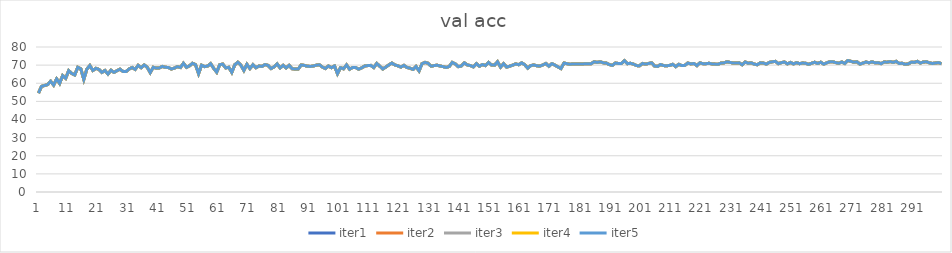
| Category | iter1 | iter2 | iter3 | iter4 | iter5 |
|---|---|---|---|---|---|
| 0 | 54.556 | 54.556 | 54.556 | 54.556 | 54.556 |
| 1 | 58.294 | 58.294 | 58.294 | 58.294 | 58.294 |
| 2 | 58.762 | 58.762 | 58.762 | 58.762 | 58.762 |
| 3 | 59.229 | 59.229 | 59.229 | 59.229 | 59.229 |
| 4 | 61.098 | 61.098 | 61.098 | 61.098 | 61.098 |
| 5 | 58.995 | 58.995 | 58.995 | 58.995 | 58.995 |
| 6 | 62.383 | 62.383 | 62.383 | 62.383 | 62.383 |
| 7 | 59.93 | 59.93 | 59.93 | 59.93 | 59.93 |
| 8 | 64.252 | 64.252 | 64.252 | 64.252 | 64.252 |
| 9 | 62.734 | 62.734 | 62.734 | 62.734 | 62.734 |
| 10 | 66.939 | 66.939 | 66.939 | 66.939 | 66.939 |
| 11 | 65.421 | 65.421 | 65.421 | 65.421 | 65.421 |
| 12 | 64.603 | 64.603 | 64.603 | 64.603 | 64.603 |
| 13 | 68.808 | 68.808 | 68.808 | 68.808 | 68.808 |
| 14 | 67.991 | 67.991 | 67.991 | 67.991 | 67.991 |
| 15 | 62.15 | 62.15 | 62.15 | 62.15 | 62.15 |
| 16 | 67.757 | 67.757 | 67.757 | 67.757 | 67.757 |
| 17 | 69.743 | 69.743 | 69.743 | 69.743 | 69.743 |
| 18 | 67.056 | 67.056 | 67.056 | 67.056 | 67.056 |
| 19 | 68.224 | 68.224 | 68.224 | 68.224 | 68.224 |
| 20 | 67.64 | 67.64 | 67.64 | 67.64 | 67.64 |
| 21 | 66.005 | 66.005 | 66.005 | 66.005 | 66.005 |
| 22 | 67.056 | 67.056 | 67.056 | 67.056 | 67.056 |
| 23 | 65.07 | 65.07 | 65.07 | 65.07 | 65.07 |
| 24 | 67.173 | 67.173 | 67.173 | 67.173 | 67.173 |
| 25 | 66.005 | 66.005 | 66.005 | 66.005 | 66.005 |
| 26 | 66.939 | 66.939 | 66.939 | 66.939 | 66.939 |
| 27 | 67.757 | 67.757 | 67.757 | 67.757 | 67.757 |
| 28 | 66.472 | 66.472 | 66.472 | 66.472 | 66.472 |
| 29 | 66.472 | 66.472 | 66.472 | 66.472 | 66.472 |
| 30 | 67.874 | 67.874 | 67.874 | 67.874 | 67.874 |
| 31 | 68.692 | 68.692 | 68.692 | 68.692 | 68.692 |
| 32 | 67.64 | 67.64 | 67.64 | 67.64 | 67.64 |
| 33 | 69.86 | 69.86 | 69.86 | 69.86 | 69.86 |
| 34 | 68.575 | 68.575 | 68.575 | 68.575 | 68.575 |
| 35 | 70.094 | 70.094 | 70.094 | 70.094 | 70.094 |
| 36 | 68.808 | 68.808 | 68.808 | 68.808 | 68.808 |
| 37 | 65.888 | 65.888 | 65.888 | 65.888 | 65.888 |
| 38 | 68.808 | 68.808 | 68.808 | 68.808 | 68.808 |
| 39 | 68.341 | 68.341 | 68.341 | 68.341 | 68.341 |
| 40 | 68.458 | 68.458 | 68.458 | 68.458 | 68.458 |
| 41 | 69.276 | 69.276 | 69.276 | 69.276 | 69.276 |
| 42 | 68.808 | 68.808 | 68.808 | 68.808 | 68.808 |
| 43 | 68.692 | 68.692 | 68.692 | 68.692 | 68.692 |
| 44 | 67.874 | 67.874 | 67.874 | 67.874 | 67.874 |
| 45 | 68.341 | 68.341 | 68.341 | 68.341 | 68.341 |
| 46 | 69.159 | 69.159 | 69.159 | 69.159 | 69.159 |
| 47 | 68.692 | 68.692 | 68.692 | 68.692 | 68.692 |
| 48 | 71.028 | 71.028 | 71.028 | 71.028 | 71.028 |
| 49 | 68.808 | 68.808 | 68.808 | 68.808 | 68.808 |
| 50 | 69.626 | 69.626 | 69.626 | 69.626 | 69.626 |
| 51 | 71.028 | 71.028 | 71.028 | 71.028 | 71.028 |
| 52 | 70.21 | 70.21 | 70.21 | 70.21 | 70.21 |
| 53 | 65.304 | 65.304 | 65.304 | 65.304 | 65.304 |
| 54 | 69.977 | 69.977 | 69.977 | 69.977 | 69.977 |
| 55 | 69.159 | 69.159 | 69.159 | 69.159 | 69.159 |
| 56 | 69.509 | 69.509 | 69.509 | 69.509 | 69.509 |
| 57 | 70.794 | 70.794 | 70.794 | 70.794 | 70.794 |
| 58 | 68.224 | 68.224 | 68.224 | 68.224 | 68.224 |
| 59 | 66.122 | 66.122 | 66.122 | 66.122 | 66.122 |
| 60 | 70.21 | 70.21 | 70.21 | 70.21 | 70.21 |
| 61 | 70.561 | 70.561 | 70.561 | 70.561 | 70.561 |
| 62 | 68.458 | 68.458 | 68.458 | 68.458 | 68.458 |
| 63 | 68.808 | 68.808 | 68.808 | 68.808 | 68.808 |
| 64 | 66.005 | 66.005 | 66.005 | 66.005 | 66.005 |
| 65 | 70.21 | 70.21 | 70.21 | 70.21 | 70.21 |
| 66 | 71.612 | 71.612 | 71.612 | 71.612 | 71.612 |
| 67 | 69.977 | 69.977 | 69.977 | 69.977 | 69.977 |
| 68 | 67.056 | 67.056 | 67.056 | 67.056 | 67.056 |
| 69 | 70.444 | 70.444 | 70.444 | 70.444 | 70.444 |
| 70 | 68.108 | 68.108 | 68.108 | 68.108 | 68.108 |
| 71 | 70.21 | 70.21 | 70.21 | 70.21 | 70.21 |
| 72 | 68.575 | 68.575 | 68.575 | 68.575 | 68.575 |
| 73 | 69.509 | 69.509 | 69.509 | 69.509 | 69.509 |
| 74 | 69.276 | 69.276 | 69.276 | 69.276 | 69.276 |
| 75 | 70.327 | 70.327 | 70.327 | 70.327 | 70.327 |
| 76 | 69.86 | 69.86 | 69.86 | 69.86 | 69.86 |
| 77 | 68.108 | 68.108 | 68.108 | 68.108 | 68.108 |
| 78 | 69.042 | 69.042 | 69.042 | 69.042 | 69.042 |
| 79 | 70.678 | 70.678 | 70.678 | 70.678 | 70.678 |
| 80 | 68.458 | 68.458 | 68.458 | 68.458 | 68.458 |
| 81 | 69.86 | 69.86 | 69.86 | 69.86 | 69.86 |
| 82 | 68.458 | 68.458 | 68.458 | 68.458 | 68.458 |
| 83 | 69.86 | 69.86 | 69.86 | 69.86 | 69.86 |
| 84 | 67.991 | 67.991 | 67.991 | 67.991 | 67.991 |
| 85 | 67.874 | 67.874 | 67.874 | 67.874 | 67.874 |
| 86 | 67.874 | 67.874 | 67.874 | 67.874 | 67.874 |
| 87 | 70.094 | 70.094 | 70.094 | 70.094 | 70.094 |
| 88 | 69.86 | 69.86 | 69.86 | 69.86 | 69.86 |
| 89 | 69.392 | 69.392 | 69.392 | 69.392 | 69.392 |
| 90 | 69.276 | 69.276 | 69.276 | 69.276 | 69.276 |
| 91 | 69.509 | 69.509 | 69.509 | 69.509 | 69.509 |
| 92 | 69.977 | 69.977 | 69.977 | 69.977 | 69.977 |
| 93 | 70.21 | 70.21 | 70.21 | 70.21 | 70.21 |
| 94 | 68.925 | 68.925 | 68.925 | 68.925 | 68.925 |
| 95 | 68.108 | 68.108 | 68.108 | 68.108 | 68.108 |
| 96 | 69.509 | 69.509 | 69.509 | 69.509 | 69.509 |
| 97 | 68.575 | 68.575 | 68.575 | 68.575 | 68.575 |
| 98 | 69.509 | 69.509 | 69.509 | 69.509 | 69.509 |
| 99 | 65.304 | 65.304 | 65.304 | 65.304 | 65.304 |
| 100 | 68.575 | 68.575 | 68.575 | 68.575 | 68.575 |
| 101 | 67.991 | 67.991 | 67.991 | 67.991 | 67.991 |
| 102 | 70.094 | 70.094 | 70.094 | 70.094 | 70.094 |
| 103 | 67.757 | 67.757 | 67.757 | 67.757 | 67.757 |
| 104 | 68.692 | 68.692 | 68.692 | 68.692 | 68.692 |
| 105 | 68.692 | 68.692 | 68.692 | 68.692 | 68.692 |
| 106 | 67.757 | 67.757 | 67.757 | 67.757 | 67.757 |
| 107 | 68.458 | 68.458 | 68.458 | 68.458 | 68.458 |
| 108 | 69.509 | 69.509 | 69.509 | 69.509 | 69.509 |
| 109 | 69.743 | 69.743 | 69.743 | 69.743 | 69.743 |
| 110 | 69.86 | 69.86 | 69.86 | 69.86 | 69.86 |
| 111 | 68.692 | 68.692 | 68.692 | 68.692 | 68.692 |
| 112 | 70.911 | 70.911 | 70.911 | 70.911 | 70.911 |
| 113 | 69.392 | 69.392 | 69.392 | 69.392 | 69.392 |
| 114 | 67.874 | 67.874 | 67.874 | 67.874 | 67.874 |
| 115 | 68.925 | 68.925 | 68.925 | 68.925 | 68.925 |
| 116 | 70.094 | 70.094 | 70.094 | 70.094 | 70.094 |
| 117 | 71.145 | 71.145 | 71.145 | 71.145 | 71.145 |
| 118 | 70.094 | 70.094 | 70.094 | 70.094 | 70.094 |
| 119 | 69.626 | 69.626 | 69.626 | 69.626 | 69.626 |
| 120 | 68.925 | 68.925 | 68.925 | 68.925 | 68.925 |
| 121 | 69.86 | 69.86 | 69.86 | 69.86 | 69.86 |
| 122 | 68.692 | 68.692 | 68.692 | 68.692 | 68.692 |
| 123 | 68.341 | 68.341 | 68.341 | 68.341 | 68.341 |
| 124 | 67.64 | 67.64 | 67.64 | 67.64 | 67.64 |
| 125 | 69.276 | 69.276 | 69.276 | 69.276 | 69.276 |
| 126 | 66.822 | 66.822 | 66.822 | 66.822 | 66.822 |
| 127 | 70.794 | 70.794 | 70.794 | 70.794 | 70.794 |
| 128 | 71.495 | 71.495 | 71.495 | 71.495 | 71.495 |
| 129 | 71.028 | 71.028 | 71.028 | 71.028 | 71.028 |
| 130 | 69.392 | 69.392 | 69.392 | 69.392 | 69.392 |
| 131 | 69.743 | 69.743 | 69.743 | 69.743 | 69.743 |
| 132 | 69.977 | 69.977 | 69.977 | 69.977 | 69.977 |
| 133 | 69.509 | 69.509 | 69.509 | 69.509 | 69.509 |
| 134 | 69.159 | 69.159 | 69.159 | 69.159 | 69.159 |
| 135 | 68.692 | 68.692 | 68.692 | 68.692 | 68.692 |
| 136 | 69.276 | 69.276 | 69.276 | 69.276 | 69.276 |
| 137 | 71.495 | 71.495 | 71.495 | 71.495 | 71.495 |
| 138 | 70.678 | 70.678 | 70.678 | 70.678 | 70.678 |
| 139 | 69.159 | 69.159 | 69.159 | 69.159 | 69.159 |
| 140 | 69.509 | 69.509 | 69.509 | 69.509 | 69.509 |
| 141 | 71.262 | 71.262 | 71.262 | 71.262 | 71.262 |
| 142 | 70.094 | 70.094 | 70.094 | 70.094 | 70.094 |
| 143 | 69.743 | 69.743 | 69.743 | 69.743 | 69.743 |
| 144 | 69.042 | 69.042 | 69.042 | 69.042 | 69.042 |
| 145 | 70.794 | 70.794 | 70.794 | 70.794 | 70.794 |
| 146 | 69.392 | 69.392 | 69.392 | 69.392 | 69.392 |
| 147 | 70.327 | 70.327 | 70.327 | 70.327 | 70.327 |
| 148 | 69.743 | 69.743 | 69.743 | 69.743 | 69.743 |
| 149 | 71.495 | 71.495 | 71.495 | 71.495 | 71.495 |
| 150 | 70.094 | 70.094 | 70.094 | 70.094 | 70.094 |
| 151 | 69.977 | 69.977 | 69.977 | 69.977 | 69.977 |
| 152 | 71.846 | 71.846 | 71.846 | 71.846 | 71.846 |
| 153 | 68.925 | 68.925 | 68.925 | 68.925 | 68.925 |
| 154 | 70.794 | 70.794 | 70.794 | 70.794 | 70.794 |
| 155 | 68.925 | 68.925 | 68.925 | 68.925 | 68.925 |
| 156 | 69.392 | 69.392 | 69.392 | 69.392 | 69.392 |
| 157 | 69.977 | 69.977 | 69.977 | 69.977 | 69.977 |
| 158 | 70.678 | 70.678 | 70.678 | 70.678 | 70.678 |
| 159 | 70.21 | 70.21 | 70.21 | 70.21 | 70.21 |
| 160 | 71.262 | 71.262 | 71.262 | 71.262 | 71.262 |
| 161 | 70.21 | 70.21 | 70.21 | 70.21 | 70.21 |
| 162 | 68.341 | 68.341 | 68.341 | 68.341 | 68.341 |
| 163 | 69.743 | 69.743 | 69.743 | 69.743 | 69.743 |
| 164 | 70.094 | 70.094 | 70.094 | 70.094 | 70.094 |
| 165 | 69.626 | 69.626 | 69.626 | 69.626 | 69.626 |
| 166 | 69.509 | 69.509 | 69.509 | 69.509 | 69.509 |
| 167 | 70.094 | 70.094 | 70.094 | 70.094 | 70.094 |
| 168 | 70.911 | 70.911 | 70.911 | 70.911 | 70.911 |
| 169 | 69.392 | 69.392 | 69.392 | 69.392 | 69.392 |
| 170 | 70.794 | 70.794 | 70.794 | 70.794 | 70.794 |
| 171 | 69.977 | 69.977 | 69.977 | 69.977 | 69.977 |
| 172 | 69.042 | 69.042 | 69.042 | 69.042 | 69.042 |
| 173 | 68.108 | 68.108 | 68.108 | 68.108 | 68.108 |
| 174 | 71.145 | 71.145 | 71.145 | 71.145 | 71.145 |
| 175 | 70.794 | 70.794 | 70.794 | 70.794 | 70.794 |
| 176 | 70.444 | 70.444 | 70.444 | 70.444 | 70.444 |
| 177 | 70.678 | 70.678 | 70.678 | 70.678 | 70.678 |
| 178 | 70.678 | 70.678 | 70.678 | 70.678 | 70.678 |
| 179 | 70.678 | 70.678 | 70.678 | 70.678 | 70.678 |
| 180 | 70.561 | 70.561 | 70.561 | 70.561 | 70.561 |
| 181 | 70.794 | 70.794 | 70.794 | 70.794 | 70.794 |
| 182 | 70.794 | 70.794 | 70.794 | 70.794 | 70.794 |
| 183 | 70.794 | 70.794 | 70.794 | 70.794 | 70.794 |
| 184 | 71.846 | 71.846 | 71.846 | 71.846 | 71.846 |
| 185 | 71.495 | 71.495 | 71.495 | 71.495 | 71.495 |
| 186 | 71.846 | 71.846 | 71.846 | 71.846 | 71.846 |
| 187 | 71.262 | 71.262 | 71.262 | 71.262 | 71.262 |
| 188 | 71.145 | 71.145 | 71.145 | 71.145 | 71.145 |
| 189 | 70.327 | 70.327 | 70.327 | 70.327 | 70.327 |
| 190 | 69.86 | 69.86 | 69.86 | 69.86 | 69.86 |
| 191 | 71.145 | 71.145 | 71.145 | 71.145 | 71.145 |
| 192 | 70.911 | 70.911 | 70.911 | 70.911 | 70.911 |
| 193 | 70.911 | 70.911 | 70.911 | 70.911 | 70.911 |
| 194 | 72.43 | 72.43 | 72.43 | 72.43 | 72.43 |
| 195 | 70.794 | 70.794 | 70.794 | 70.794 | 70.794 |
| 196 | 71.028 | 71.028 | 71.028 | 71.028 | 71.028 |
| 197 | 70.561 | 70.561 | 70.561 | 70.561 | 70.561 |
| 198 | 69.743 | 69.743 | 69.743 | 69.743 | 69.743 |
| 199 | 69.626 | 69.626 | 69.626 | 69.626 | 69.626 |
| 200 | 70.911 | 70.911 | 70.911 | 70.911 | 70.911 |
| 201 | 70.561 | 70.561 | 70.561 | 70.561 | 70.561 |
| 202 | 70.911 | 70.911 | 70.911 | 70.911 | 70.911 |
| 203 | 71.262 | 71.262 | 71.262 | 71.262 | 71.262 |
| 204 | 69.509 | 69.509 | 69.509 | 69.509 | 69.509 |
| 205 | 69.276 | 69.276 | 69.276 | 69.276 | 69.276 |
| 206 | 70.327 | 70.327 | 70.327 | 70.327 | 70.327 |
| 207 | 69.743 | 69.743 | 69.743 | 69.743 | 69.743 |
| 208 | 69.626 | 69.626 | 69.626 | 69.626 | 69.626 |
| 209 | 69.86 | 69.86 | 69.86 | 69.86 | 69.86 |
| 210 | 70.444 | 70.444 | 70.444 | 70.444 | 70.444 |
| 211 | 69.159 | 69.159 | 69.159 | 69.159 | 69.159 |
| 212 | 70.444 | 70.444 | 70.444 | 70.444 | 70.444 |
| 213 | 69.743 | 69.743 | 69.743 | 69.743 | 69.743 |
| 214 | 69.86 | 69.86 | 69.86 | 69.86 | 69.86 |
| 215 | 71.145 | 71.145 | 71.145 | 71.145 | 71.145 |
| 216 | 70.678 | 70.678 | 70.678 | 70.678 | 70.678 |
| 217 | 70.911 | 70.911 | 70.911 | 70.911 | 70.911 |
| 218 | 69.743 | 69.743 | 69.743 | 69.743 | 69.743 |
| 219 | 71.262 | 71.262 | 71.262 | 71.262 | 71.262 |
| 220 | 70.794 | 70.794 | 70.794 | 70.794 | 70.794 |
| 221 | 70.794 | 70.794 | 70.794 | 70.794 | 70.794 |
| 222 | 71.028 | 71.028 | 71.028 | 71.028 | 71.028 |
| 223 | 70.678 | 70.678 | 70.678 | 70.678 | 70.678 |
| 224 | 70.561 | 70.561 | 70.561 | 70.561 | 70.561 |
| 225 | 70.444 | 70.444 | 70.444 | 70.444 | 70.444 |
| 226 | 71.145 | 71.145 | 71.145 | 71.145 | 71.145 |
| 227 | 71.262 | 71.262 | 71.262 | 71.262 | 71.262 |
| 228 | 71.846 | 71.846 | 71.846 | 71.846 | 71.846 |
| 229 | 71.495 | 71.495 | 71.495 | 71.495 | 71.495 |
| 230 | 71.145 | 71.145 | 71.145 | 71.145 | 71.145 |
| 231 | 71.145 | 71.145 | 71.145 | 71.145 | 71.145 |
| 232 | 71.262 | 71.262 | 71.262 | 71.262 | 71.262 |
| 233 | 70.21 | 70.21 | 70.21 | 70.21 | 70.21 |
| 234 | 71.729 | 71.729 | 71.729 | 71.729 | 71.729 |
| 235 | 71.028 | 71.028 | 71.028 | 71.028 | 71.028 |
| 236 | 71.262 | 71.262 | 71.262 | 71.262 | 71.262 |
| 237 | 70.561 | 70.561 | 70.561 | 70.561 | 70.561 |
| 238 | 70.21 | 70.21 | 70.21 | 70.21 | 70.21 |
| 239 | 71.262 | 71.262 | 71.262 | 71.262 | 71.262 |
| 240 | 71.145 | 71.145 | 71.145 | 71.145 | 71.145 |
| 241 | 70.561 | 70.561 | 70.561 | 70.561 | 70.561 |
| 242 | 71.495 | 71.495 | 71.495 | 71.495 | 71.495 |
| 243 | 71.846 | 71.846 | 71.846 | 71.846 | 71.846 |
| 244 | 72.079 | 72.079 | 72.079 | 72.079 | 72.079 |
| 245 | 70.794 | 70.794 | 70.794 | 70.794 | 70.794 |
| 246 | 71.378 | 71.378 | 71.378 | 71.378 | 71.378 |
| 247 | 71.729 | 71.729 | 71.729 | 71.729 | 71.729 |
| 248 | 70.678 | 70.678 | 70.678 | 70.678 | 70.678 |
| 249 | 71.495 | 71.495 | 71.495 | 71.495 | 71.495 |
| 250 | 70.678 | 70.678 | 70.678 | 70.678 | 70.678 |
| 251 | 71.378 | 71.378 | 71.378 | 71.378 | 71.378 |
| 252 | 70.794 | 70.794 | 70.794 | 70.794 | 70.794 |
| 253 | 71.145 | 71.145 | 71.145 | 71.145 | 71.145 |
| 254 | 71.028 | 71.028 | 71.028 | 71.028 | 71.028 |
| 255 | 70.444 | 70.444 | 70.444 | 70.444 | 70.444 |
| 256 | 71.028 | 71.028 | 71.028 | 71.028 | 71.028 |
| 257 | 71.612 | 71.612 | 71.612 | 71.612 | 71.612 |
| 258 | 70.911 | 70.911 | 70.911 | 70.911 | 70.911 |
| 259 | 71.612 | 71.612 | 71.612 | 71.612 | 71.612 |
| 260 | 70.561 | 70.561 | 70.561 | 70.561 | 70.561 |
| 261 | 71.262 | 71.262 | 71.262 | 71.262 | 71.262 |
| 262 | 71.846 | 71.846 | 71.846 | 71.846 | 71.846 |
| 263 | 71.846 | 71.846 | 71.846 | 71.846 | 71.846 |
| 264 | 71.378 | 71.378 | 71.378 | 71.378 | 71.378 |
| 265 | 71.028 | 71.028 | 71.028 | 71.028 | 71.028 |
| 266 | 71.729 | 71.729 | 71.729 | 71.729 | 71.729 |
| 267 | 70.911 | 70.911 | 70.911 | 70.911 | 70.911 |
| 268 | 72.547 | 72.547 | 72.547 | 72.547 | 72.547 |
| 269 | 72.079 | 72.079 | 72.079 | 72.079 | 72.079 |
| 270 | 71.612 | 71.612 | 71.612 | 71.612 | 71.612 |
| 271 | 71.846 | 71.846 | 71.846 | 71.846 | 71.846 |
| 272 | 70.561 | 70.561 | 70.561 | 70.561 | 70.561 |
| 273 | 71.145 | 71.145 | 71.145 | 71.145 | 71.145 |
| 274 | 71.729 | 71.729 | 71.729 | 71.729 | 71.729 |
| 275 | 71.262 | 71.262 | 71.262 | 71.262 | 71.262 |
| 276 | 71.846 | 71.846 | 71.846 | 71.846 | 71.846 |
| 277 | 71.262 | 71.262 | 71.262 | 71.262 | 71.262 |
| 278 | 71.378 | 71.378 | 71.378 | 71.378 | 71.378 |
| 279 | 70.794 | 70.794 | 70.794 | 70.794 | 70.794 |
| 280 | 71.729 | 71.729 | 71.729 | 71.729 | 71.729 |
| 281 | 71.612 | 71.612 | 71.612 | 71.612 | 71.612 |
| 282 | 71.963 | 71.963 | 71.963 | 71.963 | 71.963 |
| 283 | 71.495 | 71.495 | 71.495 | 71.495 | 71.495 |
| 284 | 72.079 | 72.079 | 72.079 | 72.079 | 72.079 |
| 285 | 70.911 | 70.911 | 70.911 | 70.911 | 70.911 |
| 286 | 71.028 | 71.028 | 71.028 | 71.028 | 71.028 |
| 287 | 70.444 | 70.444 | 70.444 | 70.444 | 70.444 |
| 288 | 70.678 | 70.678 | 70.678 | 70.678 | 70.678 |
| 289 | 71.612 | 71.612 | 71.612 | 71.612 | 71.612 |
| 290 | 71.495 | 71.495 | 71.495 | 71.495 | 71.495 |
| 291 | 72.079 | 72.079 | 72.079 | 72.079 | 72.079 |
| 292 | 71.145 | 71.145 | 71.145 | 71.145 | 71.145 |
| 293 | 71.729 | 71.729 | 71.729 | 71.729 | 71.729 |
| 294 | 71.846 | 71.846 | 71.846 | 71.846 | 71.846 |
| 295 | 71.262 | 71.262 | 71.262 | 71.262 | 71.262 |
| 296 | 70.911 | 70.911 | 70.911 | 70.911 | 70.911 |
| 297 | 71.145 | 71.145 | 71.145 | 71.145 | 71.145 |
| 298 | 71.378 | 71.378 | 71.378 | 71.378 | 71.378 |
| 299 | 70.794 | 70.794 | 70.794 | 70.794 | 70.794 |